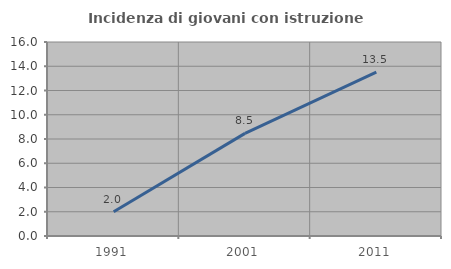
| Category | Incidenza di giovani con istruzione universitaria |
|---|---|
| 1991.0 | 2 |
| 2001.0 | 8.462 |
| 2011.0 | 13.514 |